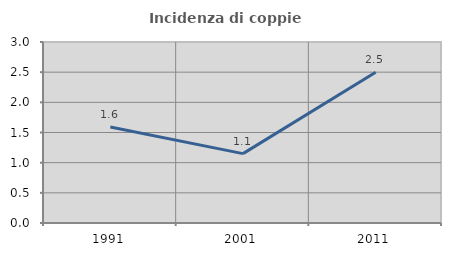
| Category | Incidenza di coppie miste |
|---|---|
| 1991.0 | 1.592 |
| 2001.0 | 1.149 |
| 2011.0 | 2.5 |